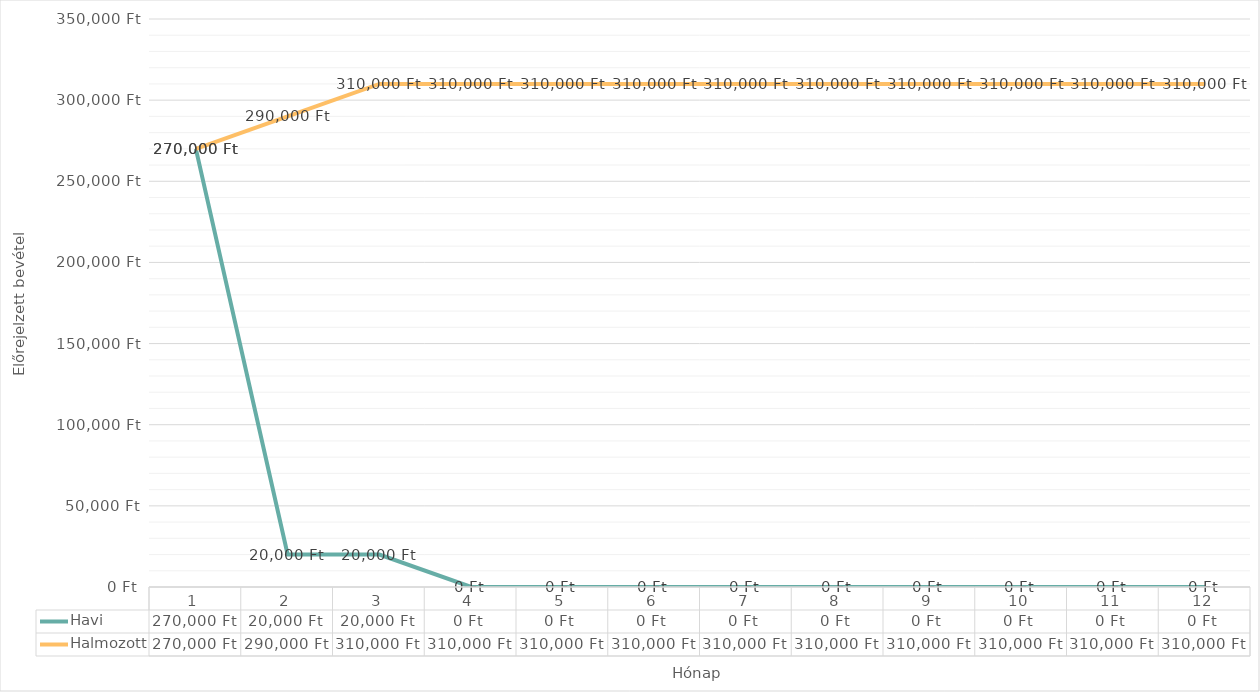
| Category | Havi | Halmozott |
|---|---|---|
| 0 | 270000 | 270000 |
| 1 | 20000 | 290000 |
| 2 | 20000 | 310000 |
| 3 | 0 | 310000 |
| 4 | 0 | 310000 |
| 5 | 0 | 310000 |
| 6 | 0 | 310000 |
| 7 | 0 | 310000 |
| 8 | 0 | 310000 |
| 9 | 0 | 310000 |
| 10 | 0 | 310000 |
| 11 | 0 | 310000 |